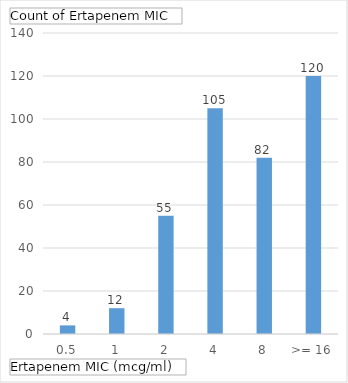
| Category | Total |
|---|---|
| 0.5 | 4 |
| 1 | 12 |
| 2 | 55 |
| 4 | 105 |
| 8 | 82 |
| >= 16 | 120 |